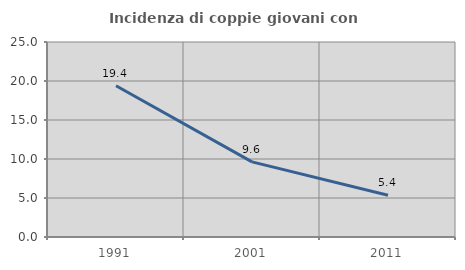
| Category | Incidenza di coppie giovani con figli |
|---|---|
| 1991.0 | 19.393 |
| 2001.0 | 9.63 |
| 2011.0 | 5.352 |